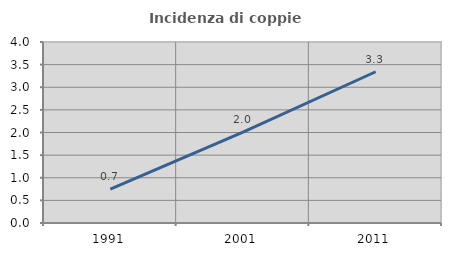
| Category | Incidenza di coppie miste |
|---|---|
| 1991.0 | 0.749 |
| 2001.0 | 2.009 |
| 2011.0 | 3.342 |